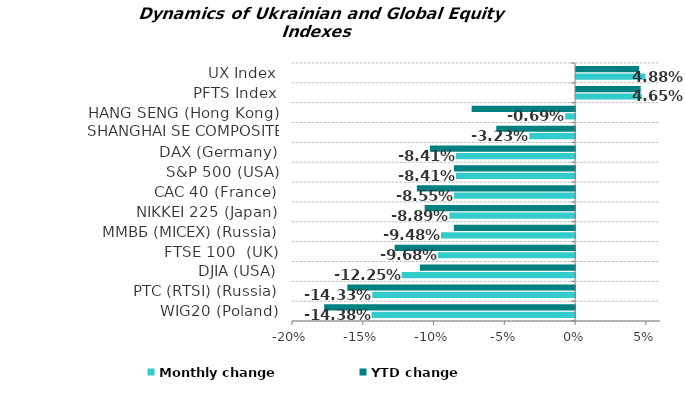
| Category | Monthly change | YTD change |
|---|---|---|
| WIG20 (Poland) | -0.144 | -0.177 |
| РТС (RTSI) (Russia) | -0.143 | -0.161 |
| DJIA (USA) | -0.123 | -0.11 |
| FTSE 100  (UK) | -0.097 | -0.128 |
| ММВБ (MICEX) (Russia) | -0.095 | -0.086 |
| NIKKEI 225 (Japan) | -0.089 | -0.106 |
| CAC 40 (France) | -0.085 | -0.112 |
| S&P 500 (USA) | -0.084 | -0.086 |
| DAX (Germany) | -0.084 | -0.103 |
| SHANGHAI SE COMPOSITE (China) | -0.032 | -0.056 |
| HANG SENG (Hong Kong) | -0.007 | -0.073 |
| PFTS Index | 0.046 | 0.046 |
| UX Index | 0.049 | 0.045 |